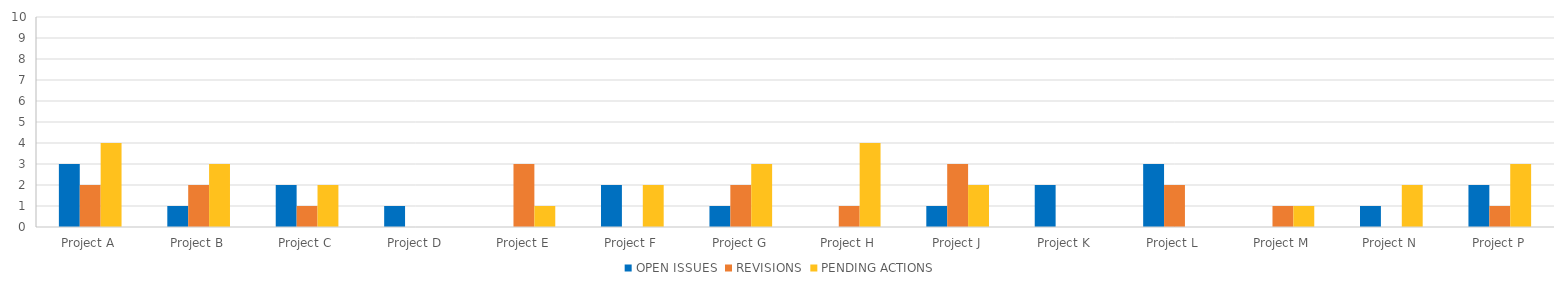
| Category | OPEN ISSUES | REVISIONS | PENDING ACTIONS |
|---|---|---|---|
| Project A | 3 | 2 | 4 |
| Project B | 1 | 2 | 3 |
| Project C | 2 | 1 | 2 |
| Project D | 1 | 0 | 0 |
| Project E | 0 | 3 | 1 |
| Project F | 2 | 0 | 2 |
| Project G | 1 | 2 | 3 |
| Project H | 0 | 1 | 4 |
| Project J | 1 | 3 | 2 |
| Project K | 2 | 0 | 0 |
| Project L | 3 | 2 | 0 |
| Project M | 0 | 1 | 1 |
| Project N | 1 | 0 | 2 |
| Project P | 2 | 1 | 3 |